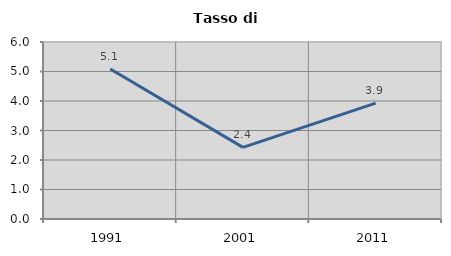
| Category | Tasso di disoccupazione   |
|---|---|
| 1991.0 | 5.086 |
| 2001.0 | 2.429 |
| 2011.0 | 3.929 |